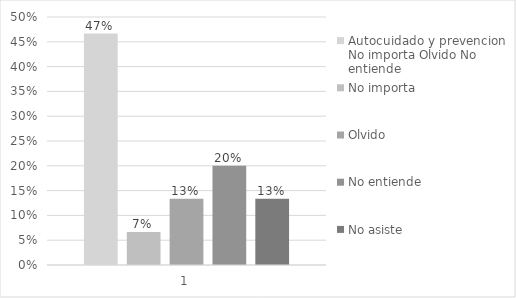
| Category | Autocuidado y prevencion No importa Olvido No entiende | No importa | Olvido | No entiende | No asiste |
|---|---|---|---|---|---|
| 0 | 0.467 | 0.067 | 0.133 | 0.2 | 0.133 |